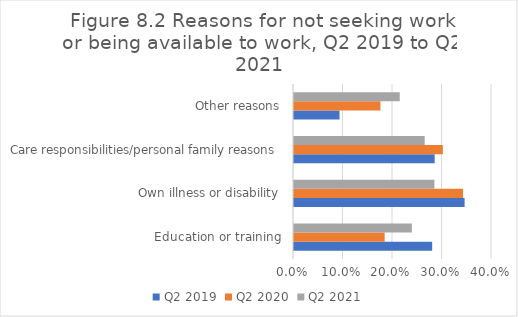
| Category | Q2 2019 | Q2 2020 | Q2 2021 |
|---|---|---|---|
| Education or training | 0.279 | 0.183 | 0.238 |
| Own illness or disability | 0.345 | 0.341 | 0.284 |
| Care responsibilities/personal family reasons | 0.284 | 0.301 | 0.264 |
| Other reasons | 0.092 | 0.175 | 0.214 |